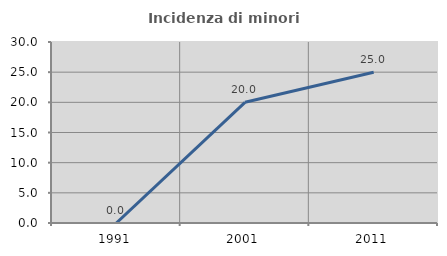
| Category | Incidenza di minori stranieri |
|---|---|
| 1991.0 | 0 |
| 2001.0 | 20 |
| 2011.0 | 25 |